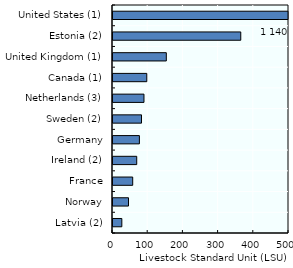
| Category | 2010 |
|---|---|
| Latvia (2) | 25.1 |
| Norway | 44.059 |
| France | 56 |
| Ireland (2) | 67.42 |
| Germany | 75 |
| Sweden (2) | 81 |
| Netherlands (3) | 88 |
| Canada (1) | 96 |
| United Kingdom (1) | 151.5 |
| Estonia (2) | 363 |
| United States (1) | 1140 |